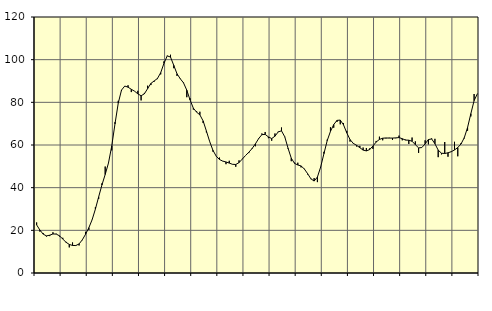
| Category | Piggar | Series 1 |
|---|---|---|
| nan | 23.7 | 22.55 |
| 87.0 | 19.4 | 20.14 |
| 87.0 | 18.7 | 18.22 |
| 87.0 | 17.1 | 17.4 |
| nan | 17.3 | 17.72 |
| 88.0 | 19.1 | 18.3 |
| 88.0 | 18.4 | 18.24 |
| 88.0 | 17.1 | 17.42 |
| nan | 16.5 | 15.93 |
| 89.0 | 14.6 | 14.41 |
| 89.0 | 12 | 13.39 |
| 89.0 | 14.3 | 12.91 |
| nan | 12.7 | 12.88 |
| 90.0 | 12.9 | 13.63 |
| 90.0 | 15.4 | 15.56 |
| 90.0 | 19.3 | 18.2 |
| nan | 20.2 | 21.24 |
| 91.0 | 24.9 | 24.99 |
| 91.0 | 30.9 | 29.95 |
| 91.0 | 34.7 | 35.7 |
| nan | 42 | 41.26 |
| 92.0 | 49.9 | 46.18 |
| 92.0 | 51.5 | 51.53 |
| 92.0 | 57.5 | 59.49 |
| nan | 70.7 | 69.9 |
| 93.0 | 80.7 | 79.64 |
| 93.0 | 85.4 | 85.75 |
| 93.0 | 87.6 | 87.63 |
| nan | 88 | 87.11 |
| 94.0 | 84.8 | 86.11 |
| 94.0 | 85.2 | 85.23 |
| 94.0 | 85.4 | 83.97 |
| nan | 80.9 | 83.08 |
| 95.0 | 84.4 | 83.98 |
| 95.0 | 87.8 | 86.44 |
| 95.0 | 88.1 | 88.86 |
| nan | 89.7 | 90.03 |
| 96.0 | 90.9 | 91.16 |
| 96.0 | 93.1 | 93.89 |
| 96.0 | 99.2 | 98.27 |
| nan | 101.9 | 101.76 |
| 97.0 | 102.3 | 101.25 |
| 97.0 | 96 | 97.34 |
| 97.0 | 92.4 | 93.39 |
| nan | 91.2 | 91.05 |
| 98.0 | 89.3 | 89.11 |
| 98.0 | 82.4 | 85.68 |
| 98.0 | 81.9 | 81.12 |
| nan | 76.6 | 77.28 |
| 99.0 | 75.8 | 75.39 |
| 99.0 | 75.6 | 74.14 |
| 99.0 | 70.3 | 71.28 |
| nan | 65.9 | 66.56 |
| 0.0 | 61.7 | 61.64 |
| 0.0 | 56.9 | 57.53 |
| 0.0 | 54.7 | 54.78 |
| nan | 54.1 | 53.2 |
| 1.0 | 52.4 | 52.45 |
| 1.0 | 51 | 52.05 |
| 1.0 | 52.6 | 51.52 |
| nan | 51 | 50.95 |
| 2.0 | 49.8 | 50.87 |
| 2.0 | 52.8 | 51.75 |
| 2.0 | 53.5 | 53.4 |
| nan | 55.1 | 55.1 |
| 3.0 | 56.2 | 56.61 |
| 3.0 | 58.6 | 58.35 |
| 3.0 | 59.4 | 60.5 |
| nan | 63.2 | 62.99 |
| 4.0 | 65.4 | 64.85 |
| 4.0 | 66.1 | 64.97 |
| 4.0 | 63.2 | 63.8 |
| nan | 62 | 63.02 |
| 5.0 | 65.4 | 64.12 |
| 5.0 | 66.3 | 66.15 |
| 5.0 | 68.2 | 66.63 |
| nan | 63.7 | 63.86 |
| 6.0 | 58.3 | 58.56 |
| 6.0 | 52.4 | 53.82 |
| 6.0 | 51.7 | 51.38 |
| nan | 51.7 | 50.62 |
| 7.0 | 49.5 | 50.18 |
| 7.0 | 48.9 | 48.76 |
| 7.0 | 46.2 | 46.58 |
| nan | 44 | 44.18 |
| 8.0 | 44.5 | 43.1 |
| 8.0 | 42.6 | 44.95 |
| 8.0 | 49.7 | 49.68 |
| nan | 56.8 | 55.94 |
| 9.0 | 62.5 | 62.04 |
| 9.0 | 68.3 | 66.39 |
| 9.0 | 68.1 | 69.58 |
| nan | 70.8 | 71.54 |
| 10.0 | 69.7 | 71.68 |
| 10.0 | 70.3 | 69.46 |
| 10.0 | 66.6 | 65.71 |
| nan | 61.6 | 62.54 |
| 11.0 | 60.6 | 60.76 |
| 11.0 | 59.3 | 59.85 |
| 11.0 | 59.6 | 58.75 |
| nan | 58.8 | 57.61 |
| 12.0 | 58.6 | 57.24 |
| 12.0 | 58.4 | 57.85 |
| 12.0 | 58.2 | 59.51 |
| nan | 61.9 | 61.39 |
| 13.0 | 63.9 | 62.61 |
| 13.0 | 62.2 | 63.18 |
| 13.0 | 63.1 | 63.3 |
| nan | 63.4 | 63.24 |
| 14.0 | 62.4 | 63.25 |
| 14.0 | 63.2 | 63.33 |
| 14.0 | 64.4 | 63.48 |
| nan | 62.2 | 62.95 |
| 15.0 | 62.5 | 62.3 |
| 15.0 | 60.5 | 62.25 |
| 15.0 | 63.5 | 61.76 |
| nan | 61.7 | 60.16 |
| 16.0 | 56.3 | 58.65 |
| 16.0 | 58.8 | 58.8 |
| 16.0 | 62.2 | 60.56 |
| nan | 60.3 | 62.55 |
| 17.0 | 63.1 | 62.84 |
| 17.0 | 62.9 | 60.58 |
| 17.0 | 54.3 | 57.61 |
| nan | 55.6 | 56.15 |
| 18.0 | 61.4 | 56.02 |
| 18.0 | 54.5 | 56.34 |
| 18.0 | 56.7 | 56.86 |
| nan | 61.5 | 57.68 |
| 19.0 | 54.7 | 58.81 |
| 19.0 | 60.9 | 60.49 |
| 19.0 | 63.1 | 63.45 |
| nan | 66.7 | 68.22 |
| 20.0 | 73.4 | 74.66 |
| 20.0 | 83.9 | 80.79 |
| 20.0 | 84.1 | 84.01 |